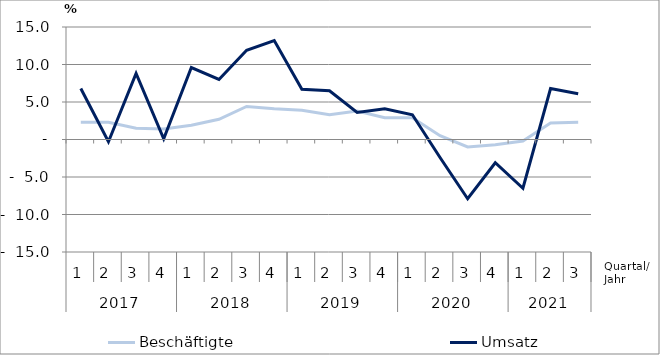
| Category | Beschäftigte | Umsatz |
|---|---|---|
| 0 | 2.3 | 6.8 |
| 1 | 2.3 | -0.3 |
| 2 | 1.5 | 8.8 |
| 3 | 1.4 | 0.1 |
| 4 | 1.9 | 9.6 |
| 5 | 2.7 | 8 |
| 6 | 4.4 | 11.9 |
| 7 | 4.1 | 13.2 |
| 8 | 3.9 | 6.7 |
| 9 | 3.3 | 6.5 |
| 10 | 3.8 | 3.6 |
| 11 | 2.9 | 4.1 |
| 12 | 2.9 | 3.3 |
| 13 | 0.5 | -2.4 |
| 14 | -1 | -7.9 |
| 15 | -0.7 | -3.1 |
| 16 | -0.2 | -6.5 |
| 17 | 2.2 | 6.8 |
| 18 | 2.3 | 6.1 |